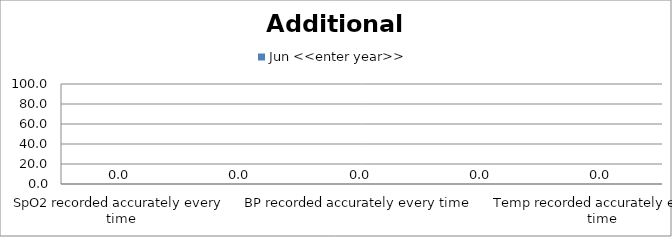
| Category | Jun <<enter year>> |
|---|---|
| SpO2 recorded accurately every time | 0 |
| CRT recorded accurately every time | 0 |
| BP recorded accurately every time | 0 |
| Skin Colour recorded accurately every time | 0 |
| Temp recorded accurately every time | 0 |